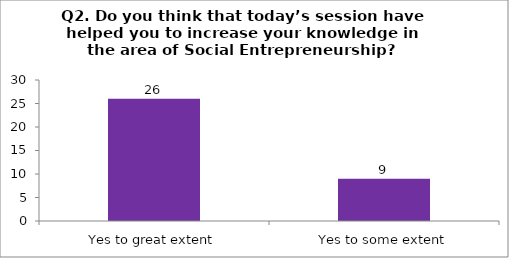
| Category | Q2. Do you think that today’s session have helped you to increase your knowledge in the area of Social Entrepreneurship? |
|---|---|
| Yes to great extent | 26 |
| Yes to some extent | 9 |